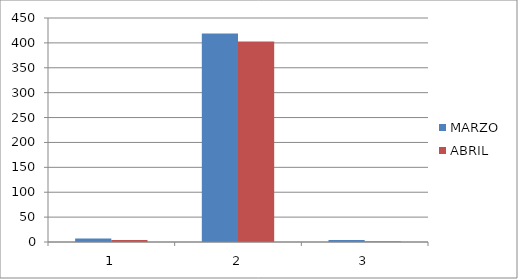
| Category | MARZO | ABRIL |
|---|---|---|
| 0 | 7 | 4 |
| 1 | 419 | 403 |
| 2 | 4 | 1 |